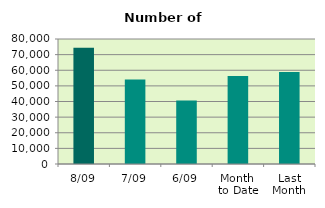
| Category | Series 0 |
|---|---|
| 8/09 | 74328 |
| 7/09 | 54148 |
| 6/09 | 40626 |
| Month 
to Date | 56390 |
| Last
Month | 58874.818 |